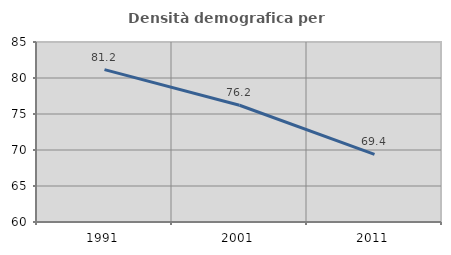
| Category | Densità demografica |
|---|---|
| 1991.0 | 81.163 |
| 2001.0 | 76.22 |
| 2011.0 | 69.38 |